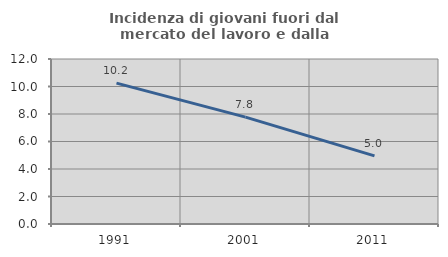
| Category | Incidenza di giovani fuori dal mercato del lavoro e dalla formazione  |
|---|---|
| 1991.0 | 10.247 |
| 2001.0 | 7.771 |
| 2011.0 | 4.955 |